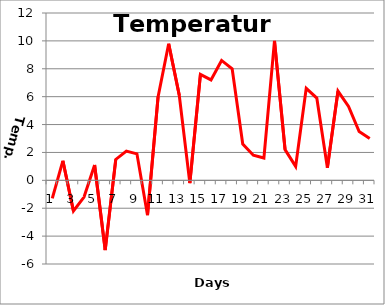
| Category | Series 0 |
|---|---|
| 0 | -1.3 |
| 1 | 1.4 |
| 2 | -2.2 |
| 3 | -1.2 |
| 4 | 1.1 |
| 5 | -5 |
| 6 | 1.5 |
| 7 | 2.1 |
| 8 | 1.9 |
| 9 | -2.5 |
| 10 | 6 |
| 11 | 9.8 |
| 12 | 6.1 |
| 13 | -0.2 |
| 14 | 7.6 |
| 15 | 7.2 |
| 16 | 8.6 |
| 17 | 8 |
| 18 | 2.6 |
| 19 | 1.8 |
| 20 | 1.6 |
| 21 | 10 |
| 22 | 2.2 |
| 23 | 1 |
| 24 | 6.6 |
| 25 | 5.9 |
| 26 | 0.9 |
| 27 | 6.4 |
| 28 | 5.3 |
| 29 | 3.5 |
| 30 | 3 |